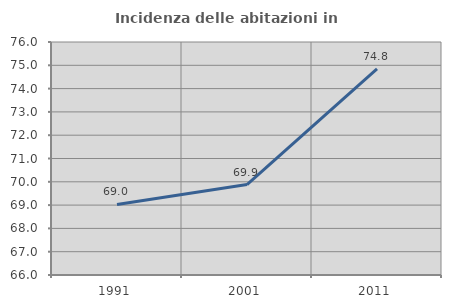
| Category | Incidenza delle abitazioni in proprietà  |
|---|---|
| 1991.0 | 69.027 |
| 2001.0 | 69.882 |
| 2011.0 | 74.843 |